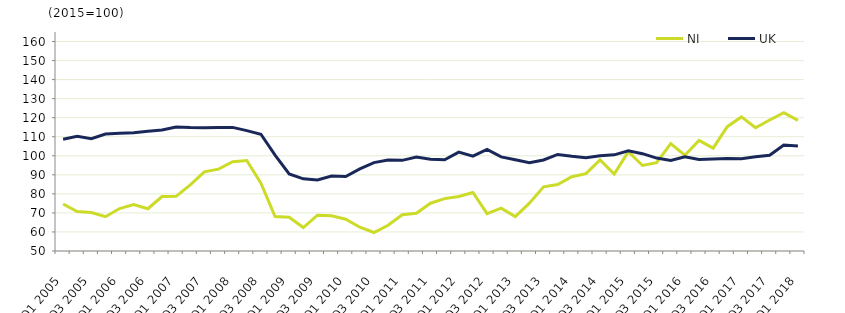
| Category | NI  | UK  |
|---|---|---|
| Q1 2005 | 74.7 | 108.7 |
|  | 70.7 | 110.2 |
| Q3 2005 | 70.2 | 109 |
|  | 68 | 111.4 |
| Q1 2006 | 72.3 | 111.8 |
|  | 74.4 | 112.1 |
| Q3 2006 | 72.2 | 112.9 |
|  | 78.6 | 113.5 |
| Q1 2007 | 78.7 | 115.1 |
|  | 84.7 | 114.8 |
| Q3 2007 | 91.6 | 114.7 |
|  | 93 | 114.9 |
| Q1 2008 | 96.9 | 114.9 |
|  | 97.5 | 113.2 |
| Q3 2008 | 85.6 | 111.3 |
|  | 68.1 | 100.3 |
| Q1 2009 | 67.7 | 90.5 |
|  | 62.3 | 87.9 |
| Q3 2009 | 68.8 | 87.3 |
|  | 68.5 | 89.4 |
| Q1 2010 | 66.7 | 89.1 |
|  | 62.5 | 93.1 |
| Q3 2010 | 59.7 | 96.4 |
|  | 63.5 | 97.8 |
| Q1 2011 | 69 | 97.6 |
|  | 69.8 | 99.3 |
| Q3 2011 | 75.1 | 98.2 |
|  | 77.5 | 97.9 |
| Q1 2012 | 78.6 | 101.9 |
|  | 80.7 | 99.8 |
| Q3 2012 | 69.6 | 103.3 |
|  | 72.5 | 99.4 |
| Q1 2013 | 68.1 | 97.9 |
|  | 75.1 | 96.4 |
| Q3 2013 | 83.7 | 97.8 |
|  | 84.9 | 100.7 |
| Q1 2014 | 89 | 99.7 |
|  | 90.6 | 99 |
| Q3 2014 | 97.8 | 100 |
|  | 90.4 | 100.5 |
| Q1 2015 | 102.2 | 102.6 |
|  | 94.9 | 101.1 |
| Q3 2015 | 96.4 | 98.8 |
|  | 106.4 | 97.5 |
| Q1 2016 | 100.3 | 99.5 |
|  | 108.1 | 98 |
| Q3 2016 | 104 | 98.3 |
|  | 115.3 | 98.6 |
| Q1 2017 | 120.4 | 98.5 |
|  | 114.7 | 99.5 |
| Q3 2017 | 118.8 | 100.3 |
|  | 122.6 | 105.7 |
| Q1 2018 | 118.6 | 105.1 |